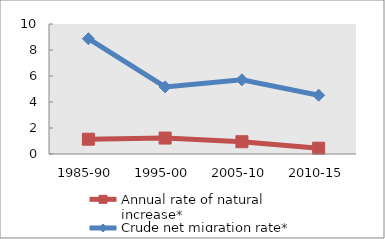
| Category | Annual rate of natural increase* | Crude net migration rate* |
|---|---|---|
| 1985-90 | 1.136 | 8.868 |
| 1995-00 | 1.226 | 5.162 |
| 2005-10 | 0.945 | 5.709 |
| 2010-15 | 0.448 | 4.524 |